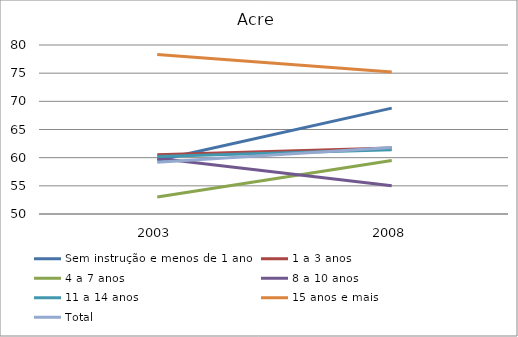
| Category | Sem instrução e menos de 1 ano | 1 a 3 anos | 4 a 7 anos | 8 a 10 anos | 11 a 14 anos | 15 anos e mais | Total |
|---|---|---|---|---|---|---|---|
| 2003.0 | 59.5 | 60.5 | 53 | 59.9 | 60.2 | 78.3 | 59.2 |
| 2008.0 | 68.8 | 61.7 | 59.5 | 55 | 61.4 | 75.2 | 61.8 |